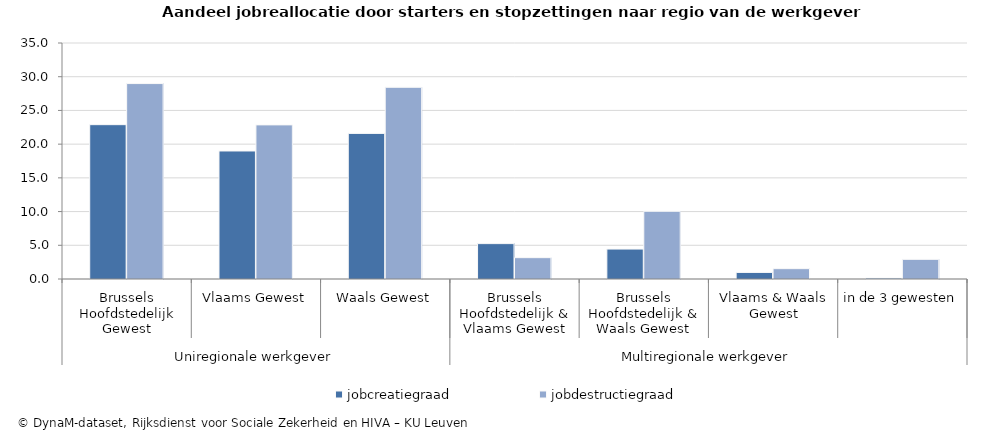
| Category | jobcreatiegraad | jobdestructiegraad |
|---|---|---|
| 0 | 22.888 | 28.983 |
| 1 | 18.986 | 22.855 |
| 2 | 21.594 | 28.433 |
| 3 | 5.247 | 3.164 |
| 4 | 4.439 | 10.042 |
| 5 | 0.974 | 1.533 |
| 6 | 0.138 | 2.912 |